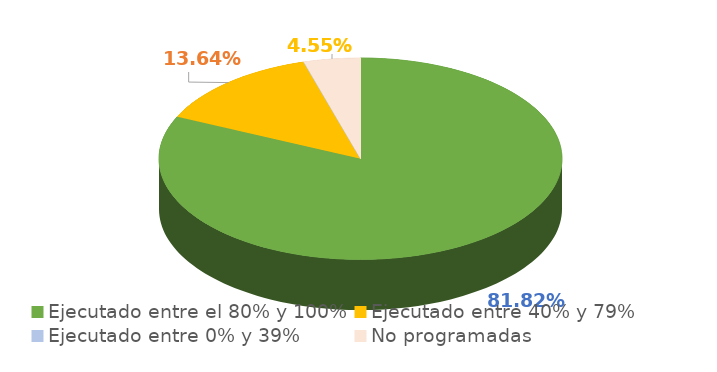
| Category | Series 0 |
|---|---|
| Ejecutado entre el 80% y 100% | 0.818 |
| Ejecutado entre 40% y 79% | 0.136 |
| Ejecutado entre 0% y 39% | 0 |
| No programadas | 0.045 |